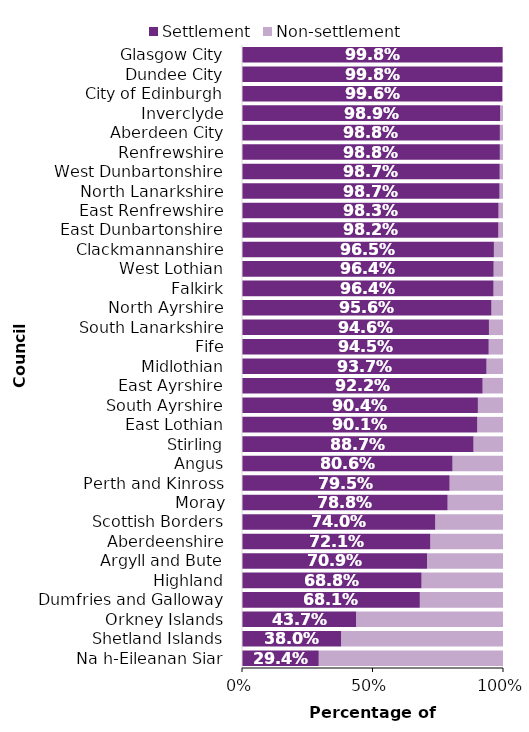
| Category | Settlement | Non-settlement |
|---|---|---|
| Na h-Eileanan Siar | 0.294 | 0.706 |
| Shetland Islands | 0.38 | 0.62 |
| Orkney Islands | 0.437 | 0.563 |
| Dumfries and Galloway | 0.681 | 0.319 |
| Highland | 0.688 | 0.312 |
| Argyll and Bute | 0.709 | 0.291 |
| Aberdeenshire | 0.721 | 0.279 |
| Scottish Borders | 0.74 | 0.26 |
| Moray | 0.788 | 0.212 |
| Perth and Kinross | 0.795 | 0.205 |
| Angus | 0.806 | 0.194 |
| Stirling | 0.887 | 0.113 |
| East Lothian | 0.901 | 0.099 |
| South Ayrshire | 0.904 | 0.096 |
| East Ayrshire | 0.922 | 0.078 |
| Midlothian | 0.937 | 0.063 |
| Fife | 0.945 | 0.055 |
| South Lanarkshire | 0.946 | 0.054 |
| North Ayrshire | 0.956 | 0.044 |
| Falkirk | 0.964 | 0.036 |
| West Lothian | 0.964 | 0.036 |
| Clackmannanshire | 0.965 | 0.035 |
| East Dunbartonshire | 0.982 | 0.018 |
| East Renfrewshire | 0.983 | 0.017 |
| North Lanarkshire | 0.987 | 0.013 |
| West Dunbartonshire | 0.987 | 0.013 |
| Renfrewshire | 0.988 | 0.012 |
| Aberdeen City | 0.988 | 0.012 |
| Inverclyde | 0.989 | 0.011 |
| City of Edinburgh | 0.996 | 0.004 |
| Dundee City | 0.998 | 0.002 |
| Glasgow City | 0.998 | 0.002 |